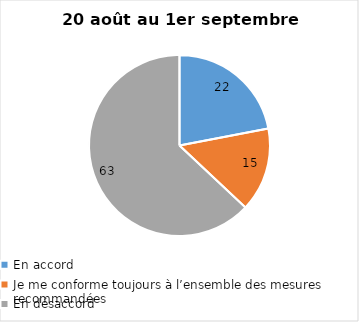
| Category | Series 0 |
|---|---|
| En accord | 22 |
| Je me conforme toujours à l’ensemble des mesures recommandées | 15 |
| En désaccord | 63 |